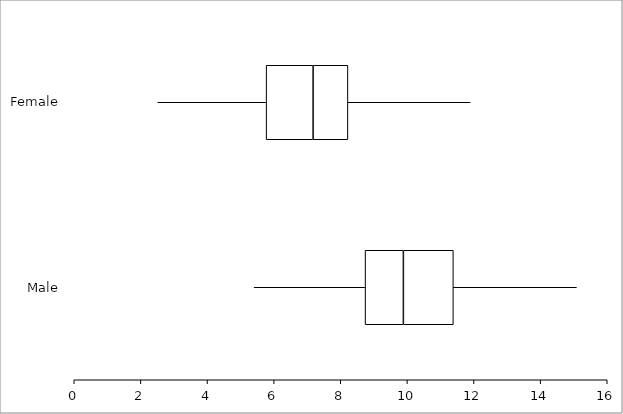
| Category | Minimum | Lower Quartile | Median | Upper Quartile | Maximum |
|---|---|---|---|---|---|
| Male | 5.4 | 3.33 | 1.15 | 1.5 | 3.71 |
| Female | 2.51 | 3.25 | 1.41 | 1.045 | 3.685 |